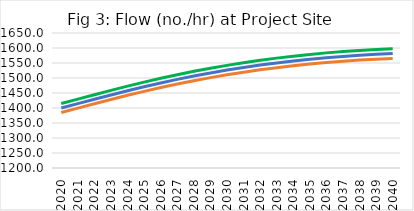
| Category | Q | Q-1se | Q+1se |
|---|---|---|---|
| 2020.0 | 1400 | 1385.124 | 1414.876 |
| 2021.0 | 1414.459 | 1399.478 | 1429.439 |
| 2022.0 | 1429.103 | 1414.032 | 1444.173 |
| 2023.0 | 1443.542 | 1428.411 | 1458.673 |
| 2024.0 | 1457.524 | 1442.264 | 1472.784 |
| 2025.0 | 1470.892 | 1455.544 | 1486.239 |
| 2026.0 | 1483.553 | 1468.081 | 1499.024 |
| 2027.0 | 1495.455 | 1479.952 | 1510.957 |
| 2028.0 | 1506.572 | 1490.945 | 1522.198 |
| 2029.0 | 1516.894 | 1501.217 | 1532.572 |
| 2030.0 | 1526.424 | 1510.698 | 1542.15 |
| 2031.0 | 1535.169 | 1519.371 | 1550.967 |
| 2032.0 | 1543.142 | 1527.247 | 1559.037 |
| 2033.0 | 1550.36 | 1534.458 | 1566.262 |
| 2034.0 | 1556.84 | 1540.88 | 1572.8 |
| 2035.0 | 1562.602 | 1546.553 | 1578.652 |
| 2036.0 | 1567.667 | 1551.582 | 1583.752 |
| 2037.0 | 1572.055 | 1555.982 | 1588.128 |
| 2038.0 | 1575.788 | 1559.653 | 1591.922 |
| 2039.0 | 1578.887 | 1562.671 | 1595.104 |
| 2040.0 | 1581.376 | 1565.156 | 1597.595 |